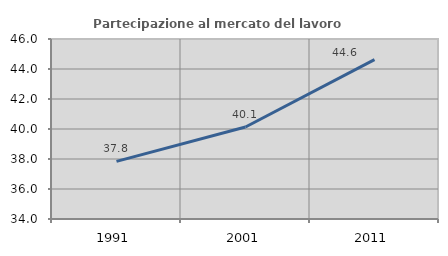
| Category | Partecipazione al mercato del lavoro  femminile |
|---|---|
| 1991.0 | 37.839 |
| 2001.0 | 40.131 |
| 2011.0 | 44.627 |